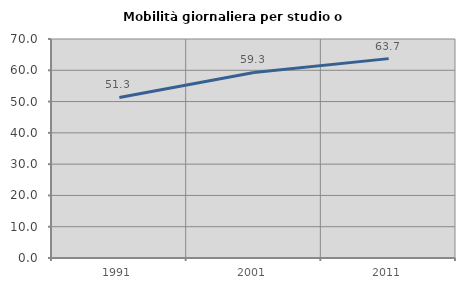
| Category | Mobilità giornaliera per studio o lavoro |
|---|---|
| 1991.0 | 51.316 |
| 2001.0 | 59.298 |
| 2011.0 | 63.727 |